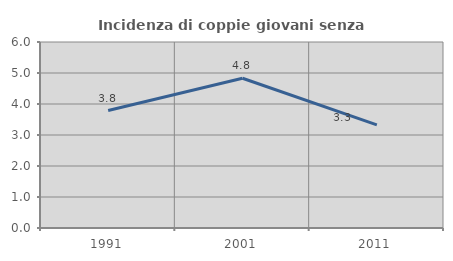
| Category | Incidenza di coppie giovani senza figli |
|---|---|
| 1991.0 | 3.789 |
| 2001.0 | 4.831 |
| 2011.0 | 3.328 |